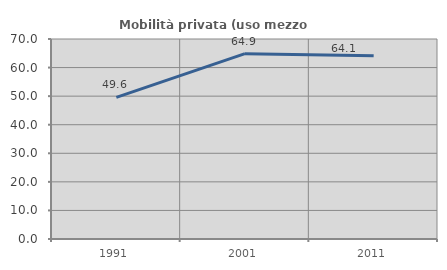
| Category | Mobilità privata (uso mezzo privato) |
|---|---|
| 1991.0 | 49.584 |
| 2001.0 | 64.859 |
| 2011.0 | 64.097 |